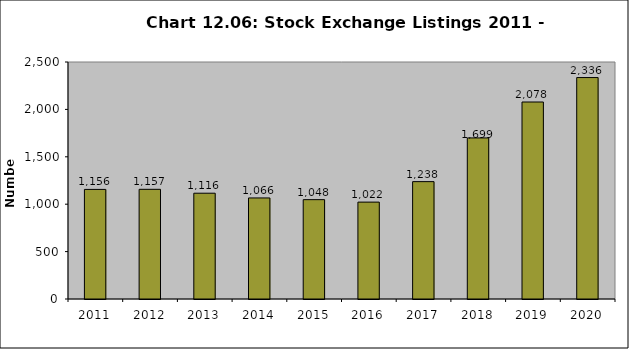
| Category | Series 0 |
|---|---|
| 2011.0 | 1156 |
| 2012.0 | 1157 |
| 2013.0 | 1116 |
| 2014.0 | 1066 |
| 2015.0 | 1048 |
| 2016.0 | 1022 |
| 2017.0 | 1238 |
| 2018.0 | 1699 |
| 2019.0 | 2078 |
| 2020.0 | 2336 |